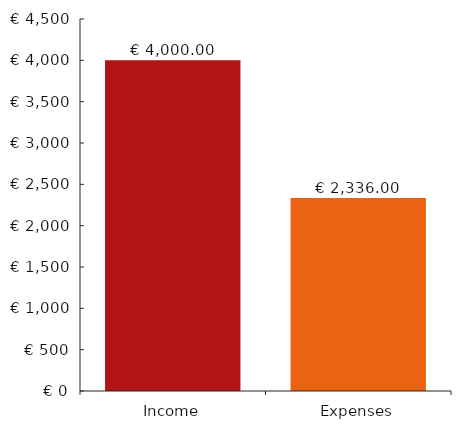
| Category | Grafiekgegevens |
|---|---|
| 0 | 4000 |
| 1 | 2336 |